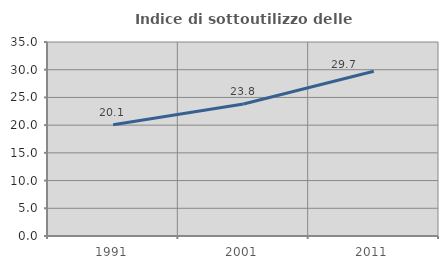
| Category | Indice di sottoutilizzo delle abitazioni  |
|---|---|
| 1991.0 | 20.056 |
| 2001.0 | 23.81 |
| 2011.0 | 29.725 |